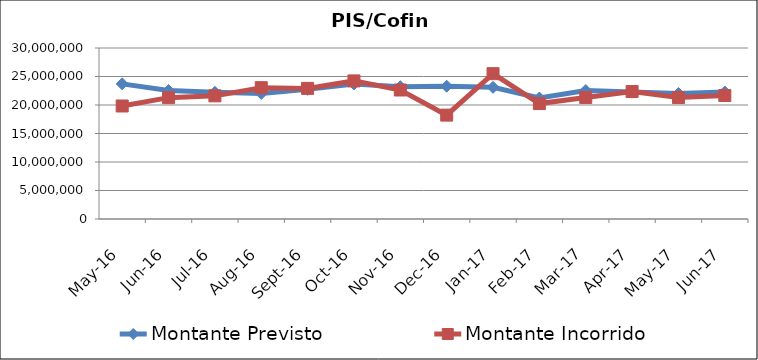
| Category | Montante Previsto | Montante Incorrido |
|---|---|---|
| 2016-05-01 | 23709414.797 | 19825748.12 |
| 2016-06-01 | 22540216.18 | 21292215.91 |
| 2016-07-01 | 22222426.622 | 21606170.86 |
| 2016-08-01 | 22019184.953 | 23038880.22 |
| 2016-09-01 | 22749872.373 | 22914814.92 |
| 2016-10-01 | 23681719.564 | 24226023.92 |
| 2016-11-01 | 23217864.797 | 22629524.58 |
| 2016-12-01 | 23296162.873 | 18226047.97 |
| 2017-01-01 | 23101262.199 | 25494025.88 |
| 2017-02-01 | 21219425.452 | 20248346.17 |
| 2017-03-01 | 22538950.175 | 21322806.673 |
| 2017-04-01 | 22286545.942 | 22355059.574 |
| 2017-05-01 | 22014973.856 | 21308737.473 |
| 2017-06-01 | 22280156.658 | 21662201.24 |